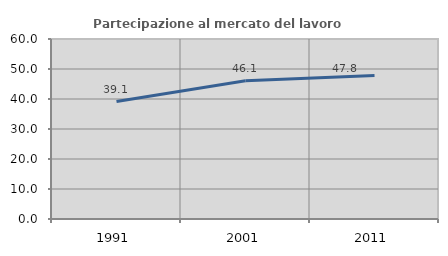
| Category | Partecipazione al mercato del lavoro  femminile |
|---|---|
| 1991.0 | 39.144 |
| 2001.0 | 46.098 |
| 2011.0 | 47.795 |